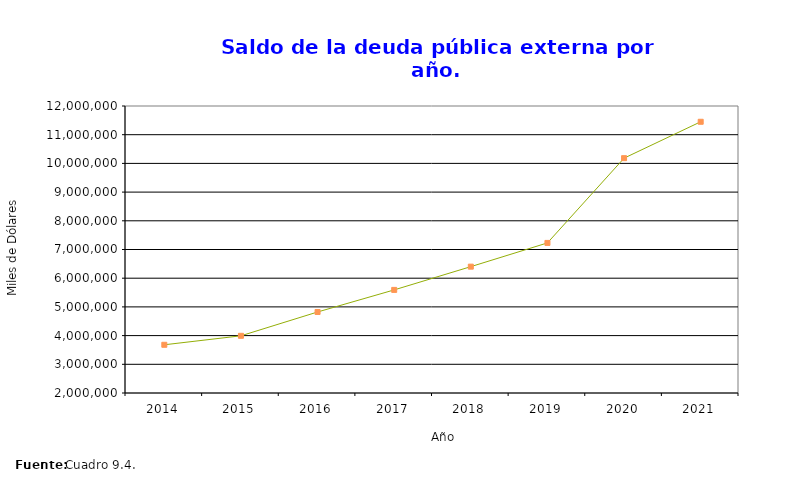
| Category | Saldos |
|---|---|
| 2014.0 | 3679598 |
| 2015.0 | 3993084 |
| 2016.0 | 4822606 |
| 2017.0 | 5592272 |
| 2018.0 | 6402602 |
| 2019.0 | 7229396 |
| 2020.0 | 10182196 |
| 2021.0 | 11450164 |